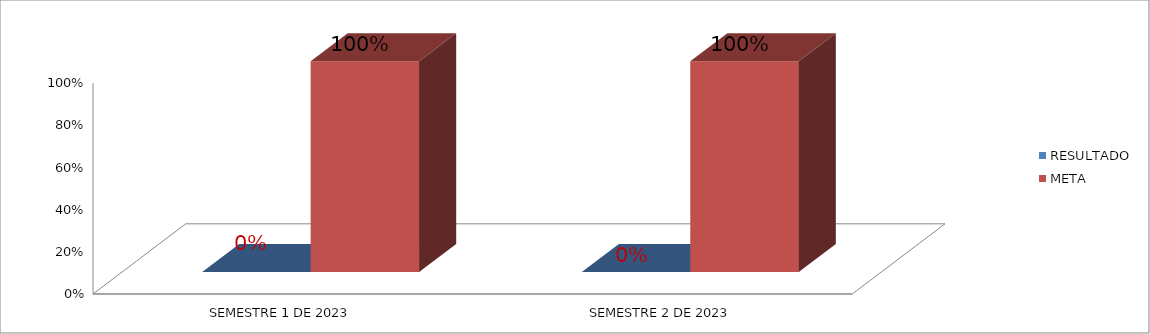
| Category | RESULTADO | META |
|---|---|---|
| SEMESTRE 1 DE 2023 | 0 | 1 |
| SEMESTRE 2 DE 2023 | 0 | 1 |